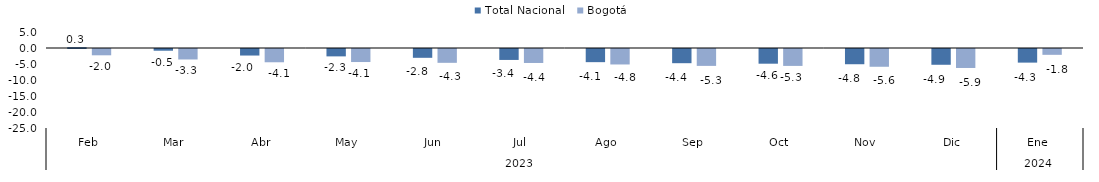
| Category | Total Nacional | Bogotá |
|---|---|---|
| 0 | 0.25 | -1.97 |
| 1 | -0.536 | -3.274 |
| 2 | -2.042 | -4.147 |
| 3 | -2.306 | -4.076 |
| 4 | -2.752 | -4.32 |
| 5 | -3.417 | -4.366 |
| 6 | -4.113 | -4.836 |
| 7 | -4.438 | -5.275 |
| 8 | -4.594 | -5.282 |
| 9 | -4.762 | -5.551 |
| 10 | -4.929 | -5.929 |
| 11 | -4.257 | -1.819 |